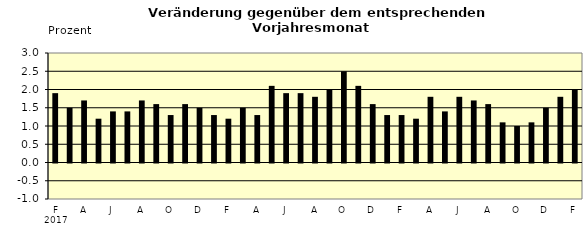
| Category | Series 0 |
|---|---|
| 0 | 1.9 |
| 1 | 1.5 |
| 2 | 1.7 |
| 3 | 1.2 |
| 4 | 1.4 |
| 5 | 1.4 |
| 6 | 1.7 |
| 7 | 1.6 |
| 8 | 1.3 |
| 9 | 1.6 |
| 10 | 1.5 |
| 11 | 1.3 |
| 12 | 1.2 |
| 13 | 1.5 |
| 14 | 1.3 |
| 15 | 2.1 |
| 16 | 1.9 |
| 17 | 1.9 |
| 18 | 1.8 |
| 19 | 2 |
| 20 | 2.5 |
| 21 | 2.1 |
| 22 | 1.6 |
| 23 | 1.3 |
| 24 | 1.3 |
| 25 | 1.2 |
| 26 | 1.8 |
| 27 | 1.4 |
| 28 | 1.8 |
| 29 | 1.7 |
| 30 | 1.6 |
| 31 | 1.1 |
| 32 | 1 |
| 33 | 1.1 |
| 34 | 1.5 |
| 35 | 1.8 |
| 36 | 2 |